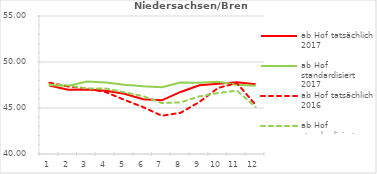
| Category | ab Hof tatsächlich 2017 | ab Hof standardisiert 2017 | ab Hof tatsächlich 2016 | ab Hof standardisiert 2016 |
|---|---|---|---|---|
| 0 | 47.441 | 47.493 | 47.756 | 47.535 |
| 1 | 46.99 | 47.4 | 47.339 | 47.452 |
| 2 | 47.004 | 47.872 | 47.135 | 47.116 |
| 3 | 46.87 | 47.772 | 46.734 | 47.123 |
| 4 | 46.547 | 47.537 | 45.883 | 46.705 |
| 5 | 45.952 | 47.369 | 45.097 | 46.287 |
| 6 | 45.833 | 47.264 | 44.157 | 45.543 |
| 7 | 46.744 | 47.77 | 44.481 | 45.608 |
| 8 | 47.478 | 47.733 | 45.658 | 46.263 |
| 9 | 47.636 | 47.846 | 47.179 | 46.625 |
| 10 | 47.806 | 47.539 | 47.711 | 46.888 |
| 11 | 47.58 | 47.416 | 45.337 | 45.107 |